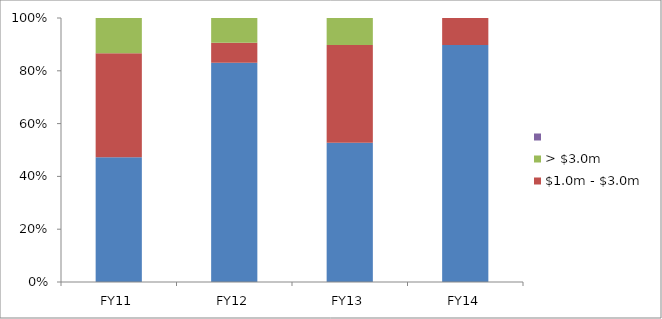
| Category | < $1.0m | $1.0m - $3.0m | > $3.0m | Series 3 |
|---|---|---|---|---|
| FY11 | 120 | 100 | 34 |  |
| FY12 | 265.395 | 24 | 30 |  |
| FY13 | 195 | 137 | 38 |  |
| FY14 | 1028.2 | 117 | 0 |  |